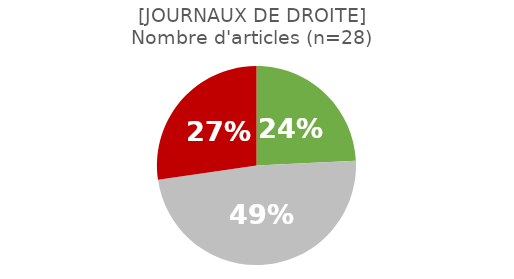
| Category | Series 0 |
|---|---|
| 0 | 0.286 |
| 1 | 0.571 |
| 2 | 0.321 |